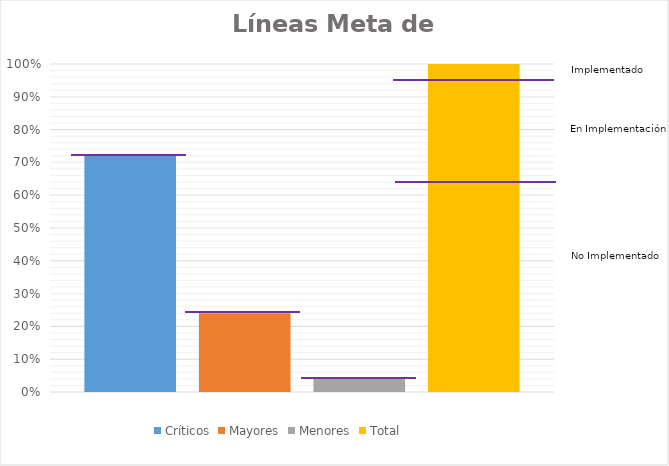
| Category | Críticos | Mayores | Menores | Total |
|---|---|---|---|---|
| Logro alcanzado | 0.72 | 0.24 | 0.04 | 1 |